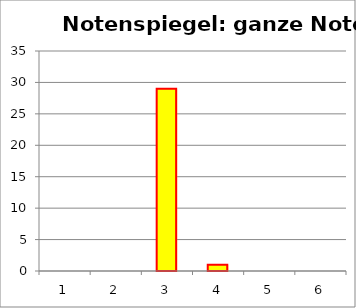
| Category | Series 0 |
|---|---|
| 1.0 | 0 |
| 2.0 | 0 |
| 3.0 | 29 |
| 4.0 | 1 |
| 5.0 | 0 |
| 6.0 | 0 |